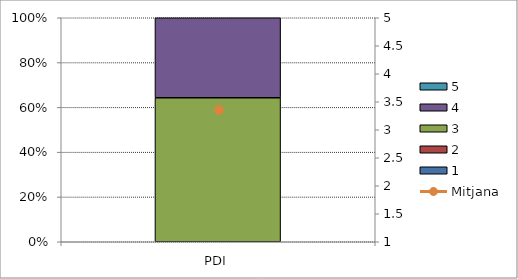
| Category | 1 | 2 | 3 | 4 | 5 |
|---|---|---|---|---|---|
| PDI | 0 | 0 | 9 | 5 | 0 |